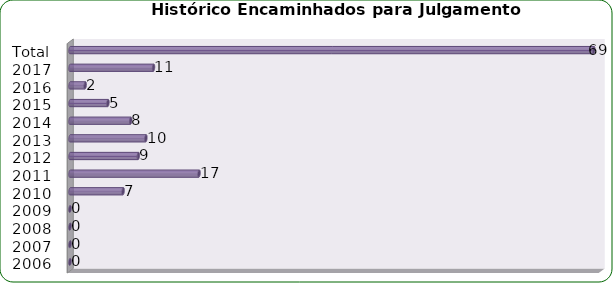
| Category | Total de Sindicâncias  |
|---|---|
| 2006 | 0 |
| 2007 | 0 |
| 2008 | 0 |
| 2009 | 0 |
| 2010 | 7 |
| 2011 | 17 |
| 2012 | 9 |
| 2013 | 10 |
| 2014 | 8 |
| 2015 | 5 |
| 2016 | 2 |
| 2017 | 11 |
| Total | 69 |